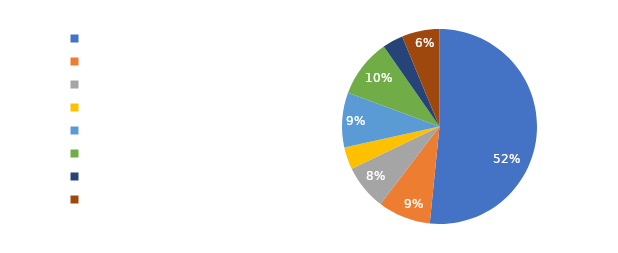
| Category | Total |
|---|---|
| SO - Ăn tối | 0.516 |
| SO - Ăn trưa | 0.088 |
| SO - Xe cộ | 0.075 |
| TD - Tự do chi tiêu | 0.037 |
| TD - Tự do mua sắm | 0.091 |
| SO - Nhà | 0.097 |
| SO - Làm đẹp | 0.034 |
| SO - Mua sắm | 0.063 |